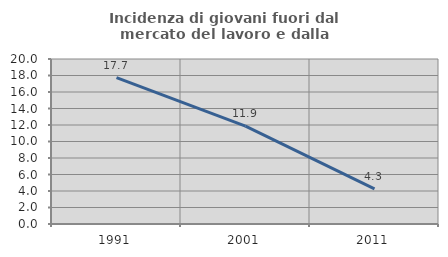
| Category | Incidenza di giovani fuori dal mercato del lavoro e dalla formazione  |
|---|---|
| 1991.0 | 17.742 |
| 2001.0 | 11.864 |
| 2011.0 | 4.255 |